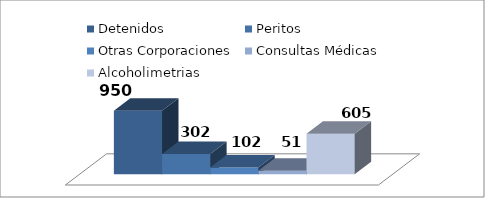
| Category | Detenidos | Peritos | Otras Corporaciones | Consultas Médicas | Alcoholimetrias |
|---|---|---|---|---|---|
| 0 | 950 | 302 | 102 | 51 | 605 |